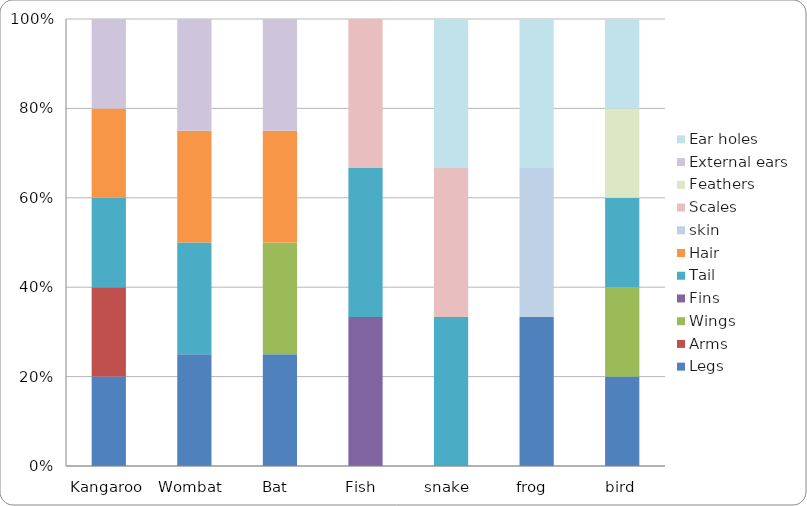
| Category | Legs | Arms | Wings | Fins | Tail | Hair | skin | Scales | Feathers | External ears | Ear holes |
|---|---|---|---|---|---|---|---|---|---|---|---|
| Kangaroo | 1 | 1 | 0 | 0 | 1 | 1 | 0 | 0 | 0 | 1 | 0 |
| Wombat  | 1 | 0 | 0 | 0 | 1 | 1 | 0 | 0 | 0 | 1 | 0 |
| Bat  | 1 | 0 | 1 | 0 | 0 | 1 | 0 | 0 | 0 | 1 | 0 |
| Fish  | 0 | 0 | 0 | 1 | 1 | 0 | 0 | 1 | 0 | 0 | 0 |
| snake  | 0 | 0 | 0 | 0 | 1 | 0 | 0 | 1 | 0 | 0 | 1 |
| frog  | 1 | 0 | 0 | 0 | 0 | 0 | 1 | 0 | 0 | 0 | 1 |
| bird | 1 | 0 | 1 | 0 | 1 | 0 | 0 | 0 | 1 | 0 | 1 |